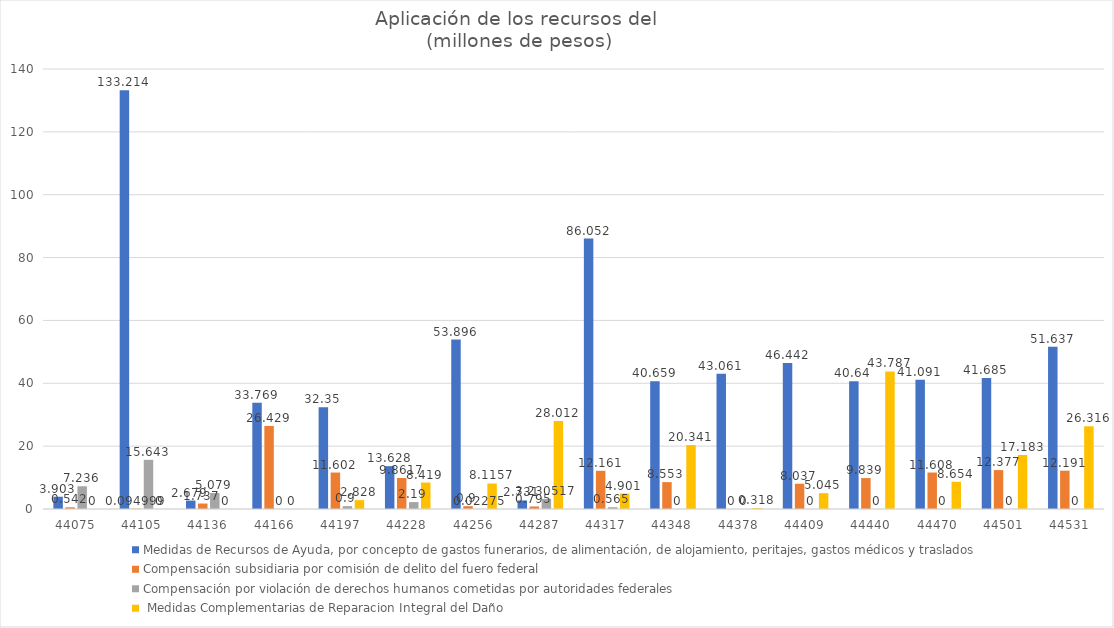
| Category | Medidas de Recursos de Ayuda, por concepto de gastos funerarios, de alimentación, de alojamiento, peritajes, gastos médicos y traslados | Compensación subsidiaria por comisión de delito del fuero federal | Compensación por violación de derechos humanos cometidas por autoridades federales |  Medidas Complementarias de Reparacion Integral del Daño |
|---|---|---|---|---|
| 44075.0 | 3.903 | 0.542 | 7.236 | 0 |
| 44105.0 | 133.214 | 0.095 | 15.643 | 0 |
| 44136.0 | 2.679 | 1.737 | 5.079 | 0 |
| 44166.0 | 33.769 | 26.429 | 0 | 0 |
| 44197.0 | 32.35 | 11.602 | 0.9 | 2.828 |
| 44228.0 | 13.628 | 9.862 | 2.19 | 8.419 |
| 44256.0 | 53.896 | 0.9 | 0.023 | 8.116 |
| 44287.0 | 2.731 | 0.795 | 3.231 | 28.012 |
| 44317.0 | 86.052 | 12.161 | 0.565 | 4.901 |
| 44348.0 | 40.659 | 8.553 | 0 | 20.341 |
| 44378.0 | 43.061 | 0 | 0 | 0.318 |
| 44409.0 | 46.442 | 8.037 | 0 | 5.045 |
| 44440.0 | 40.64 | 9.839 | 0 | 43.787 |
| 44470.0 | 41.091 | 11.608 | 0 | 8.654 |
| 44501.0 | 41.685 | 12.377 | 0 | 17.183 |
| 44531.0 | 51.637 | 12.191 | 0 | 26.316 |